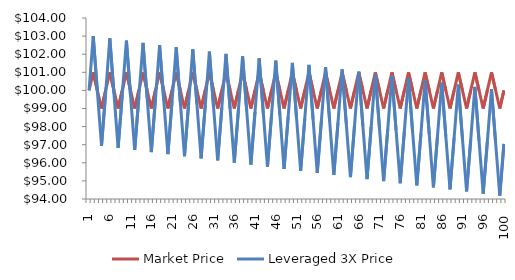
| Category | Market Price | Leveraged 3X Price |
|---|---|---|
| 1.0 | 100 | 100 |
| 2.0 | 101 | 103 |
| 3.0 | 100 | 99.941 |
| 4.0 | 99 | 96.942 |
| 5.0 | 100 | 99.88 |
| 6.0 | 101 | 102.876 |
| 7.0 | 100 | 99.821 |
| 8.0 | 99 | 96.826 |
| 9.0 | 100 | 99.76 |
| 10.0 | 101 | 102.753 |
| 11.0 | 100 | 99.701 |
| 12.0 | 99 | 96.71 |
| 13.0 | 100 | 99.641 |
| 14.0 | 101 | 102.63 |
| 15.0 | 100 | 99.581 |
| 16.0 | 99 | 96.594 |
| 17.0 | 100 | 99.521 |
| 18.0 | 101 | 102.507 |
| 19.0 | 100 | 99.462 |
| 20.0 | 99 | 96.478 |
| 21.0 | 100 | 99.402 |
| 22.0 | 101 | 102.384 |
| 23.0 | 100 | 99.343 |
| 24.0 | 99 | 96.362 |
| 25.0 | 100 | 99.282 |
| 26.0 | 101 | 102.261 |
| 27.0 | 100 | 99.223 |
| 28.0 | 99 | 96.247 |
| 29.0 | 100 | 99.163 |
| 30.0 | 101 | 102.138 |
| 31.0 | 100 | 99.104 |
| 32.0 | 99 | 96.131 |
| 33.0 | 100 | 99.044 |
| 34.0 | 101 | 102.016 |
| 35.0 | 100 | 98.985 |
| 36.0 | 99 | 96.016 |
| 37.0 | 100 | 98.925 |
| 38.0 | 101 | 101.893 |
| 39.0 | 100 | 98.867 |
| 40.0 | 99 | 95.901 |
| 41.0 | 100 | 98.807 |
| 42.0 | 101 | 101.771 |
| 43.0 | 100 | 98.748 |
| 44.0 | 99 | 95.786 |
| 45.0 | 100 | 98.688 |
| 46.0 | 101 | 101.649 |
| 47.0 | 100 | 98.63 |
| 48.0 | 99 | 95.671 |
| 49.0 | 100 | 98.57 |
| 50.0 | 101 | 101.527 |
| 51.0 | 100 | 98.511 |
| 52.0 | 99 | 95.556 |
| 53.0 | 100 | 98.451 |
| 54.0 | 101 | 101.405 |
| 55.0 | 100 | 98.393 |
| 56.0 | 99 | 95.441 |
| 57.0 | 100 | 98.333 |
| 58.0 | 101 | 101.283 |
| 59.0 | 100 | 98.275 |
| 60.0 | 99 | 95.327 |
| 61.0 | 100 | 98.215 |
| 62.0 | 101 | 101.162 |
| 63.0 | 100 | 98.157 |
| 64.0 | 99 | 95.212 |
| 65.0 | 100 | 98.098 |
| 66.0 | 101 | 101.04 |
| 67.0 | 100 | 98.039 |
| 68.0 | 99 | 95.098 |
| 69.0 | 100 | 97.98 |
| 70.0 | 101 | 100.919 |
| 71.0 | 100 | 97.922 |
| 72.0 | 99 | 94.984 |
| 73.0 | 100 | 97.862 |
| 74.0 | 101 | 100.798 |
| 75.0 | 100 | 97.804 |
| 76.0 | 99 | 94.87 |
| 77.0 | 100 | 97.745 |
| 78.0 | 101 | 100.677 |
| 79.0 | 100 | 97.687 |
| 80.0 | 99 | 94.756 |
| 81.0 | 100 | 97.628 |
| 82.0 | 101 | 100.556 |
| 83.0 | 100 | 97.57 |
| 84.0 | 99 | 94.643 |
| 85.0 | 100 | 97.511 |
| 86.0 | 101 | 100.436 |
| 87.0 | 100 | 97.453 |
| 88.0 | 99 | 94.529 |
| 89.0 | 100 | 97.394 |
| 90.0 | 101 | 100.315 |
| 91.0 | 100 | 97.336 |
| 92.0 | 99 | 94.416 |
| 93.0 | 100 | 97.277 |
| 94.0 | 101 | 100.195 |
| 95.0 | 100 | 97.219 |
| 96.0 | 99 | 94.302 |
| 97.0 | 100 | 97.16 |
| 98.0 | 101 | 100.075 |
| 99.0 | 100 | 97.102 |
| 100.0 | 99 | 94.189 |
| 100.0 | 100 | 97.043 |